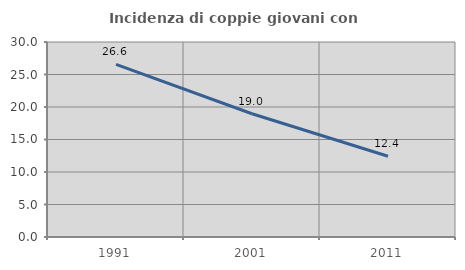
| Category | Incidenza di coppie giovani con figli |
|---|---|
| 1991.0 | 26.553 |
| 2001.0 | 18.959 |
| 2011.0 | 12.431 |